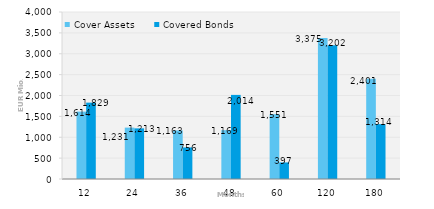
| Category | Cover Assets | Covered Bonds |
|---|---|---|
| 12.0 | 1613.949 | 1829.098 |
| 24.0 | 1230.686 | 1212.616 |
| 36.0 | 1163.409 | 755.613 |
| 48.0 | 1169.45 | 2014.408 |
| 60.0 | 1551.381 | 396.5 |
| 120.0 | 3374.942 | 3202.285 |
| 180.0 | 2401.462 | 1313.94 |